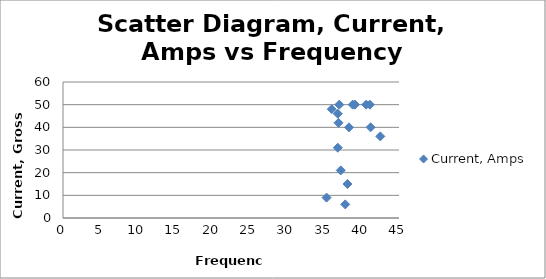
| Category | Current, Amps |
|---|---|
| 37.8 | 6 |
| 35.3 | 9 |
| 37.2 | 21 |
| 36.8 | 31 |
| 38.1 | 15 |
| 36.9 | 42 |
| 38.3 | 40 |
| 36.0 | 48 |
| 36.8 | 46 |
| 37.0 | 50 |
| 38.8 | 50 |
| 41.1 | 50 |
| 39.1 | 50 |
| 40.6 | 50 |
| 41.2 | 40 |
| 42.5 | 36 |